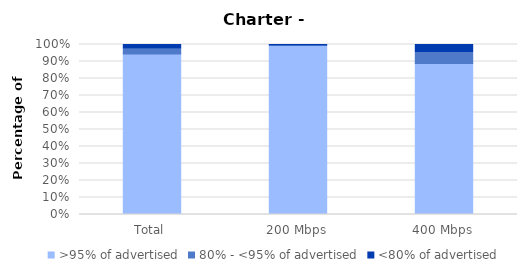
| Category | >95% of advertised | 80% - <95% of advertised | <80% of advertised |
|---|---|---|---|
| Total | 0.944 | 0.028 | 0.028 |
| 200 Mbps | 0.99 | 0 | 0.01 |
| 400 Mbps | 0.889 | 0.062 | 0.049 |